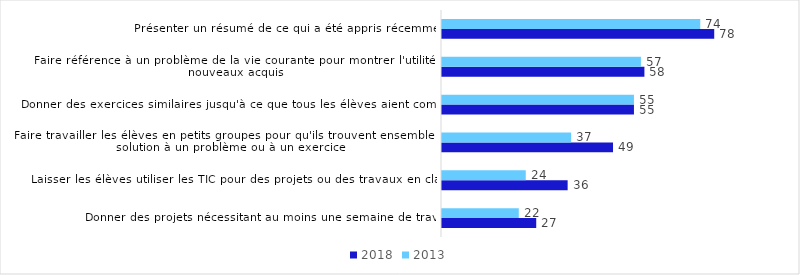
| Category | 2018 | 2013 |
|---|---|---|
| Donner des projets nécessitant au moins une semaine de travail | 27 | 22 |
| Laisser les élèves utiliser les TIC pour des projets ou des travaux en classe | 36 | 24 |
| Faire travailler les élèves en petits groupes pour qu'ils trouvent ensemble une solution à un problème ou à un exercice | 49 | 37 |
| Donner des exercices similaires jusqu'à ce que tous les élèves aient compris | 55 | 55 |
| Faire référence à un problème de la vie courante pour montrer l'utilité des nouveaux acquis | 58 | 57 |
| Présenter un résumé de ce qui a été appris récemment | 78 | 74 |